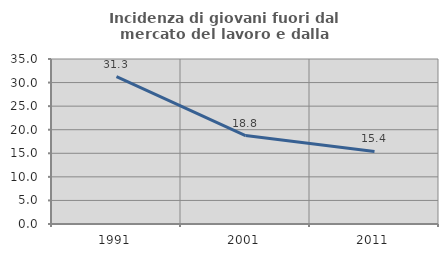
| Category | Incidenza di giovani fuori dal mercato del lavoro e dalla formazione  |
|---|---|
| 1991.0 | 31.25 |
| 2001.0 | 18.75 |
| 2011.0 | 15.385 |